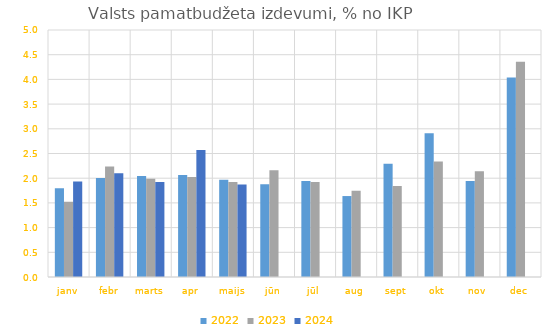
| Category | 2022 | 2023 | 2024 |
|---|---|---|---|
| janv | 1.796 | 1.523 | 1.933 |
| febr | 2.004 | 2.238 | 2.1 |
| marts | 2.044 | 1.987 | 1.923 |
| apr | 2.064 | 2.022 | 2.569 |
| maijs | 1.97 | 1.922 | 1.871 |
| jūn | 1.88 | 2.162 | 0 |
| jūl | 1.943 | 1.921 | 0 |
| aug | 1.639 | 1.746 | 0 |
| sept | 2.291 | 1.842 | 0 |
| okt | 2.911 | 2.338 | 0 |
| nov | 1.942 | 2.143 | 0 |
| dec | 4.039 | 4.356 | 0 |